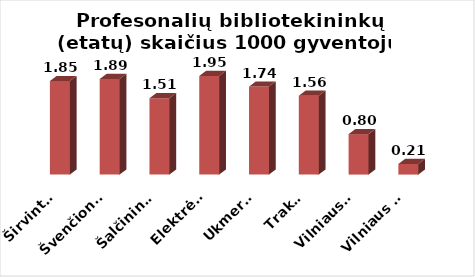
| Category | Series 0 |
|---|---|
| Širvintos | 1.85 |
| Švenčionys | 1.89 |
| Šalčininkai | 1.51 |
| Elektrėnai | 1.95 |
| Ukmergė | 1.74 |
| Trakai | 1.56 |
| Vilniaus r. | 0.8 |
| Vilniaus m. | 0.21 |